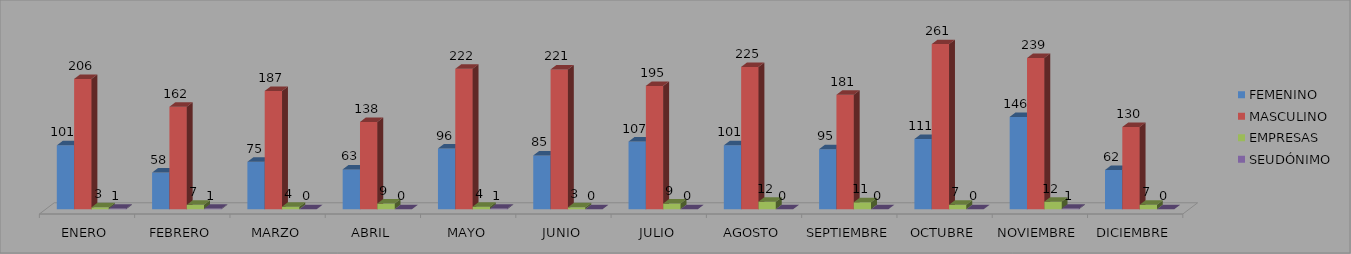
| Category | FEMENINO | MASCULINO | EMPRESAS | SEUDÓNIMO |
|---|---|---|---|---|
| ENERO | 101 | 206 | 3 | 1 |
| FEBRERO | 58 | 162 | 7 | 1 |
| MARZO | 75 | 187 | 4 | 0 |
| ABRIL | 63 | 138 | 9 | 0 |
| MAYO | 96 | 222 | 4 | 1 |
| JUNIO | 85 | 221 | 3 | 0 |
| JULIO | 107 | 195 | 9 | 0 |
| AGOSTO | 101 | 225 | 12 | 0 |
| SEPTIEMBRE | 95 | 181 | 11 | 0 |
| OCTUBRE | 111 | 261 | 7 | 0 |
| NOVIEMBRE | 146 | 239 | 12 | 1 |
| DICIEMBRE | 62 | 130 | 7 | 0 |